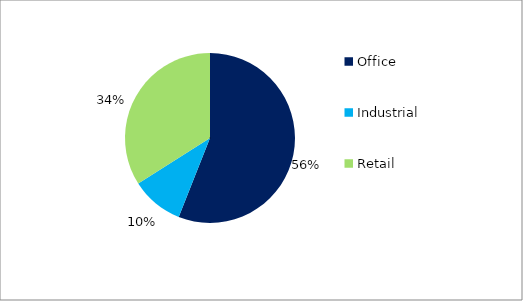
| Category | Series 0 |
|---|---|
| Office | 0.56 |
| Industrial  | 0.1 |
| Retail  | 0.34 |